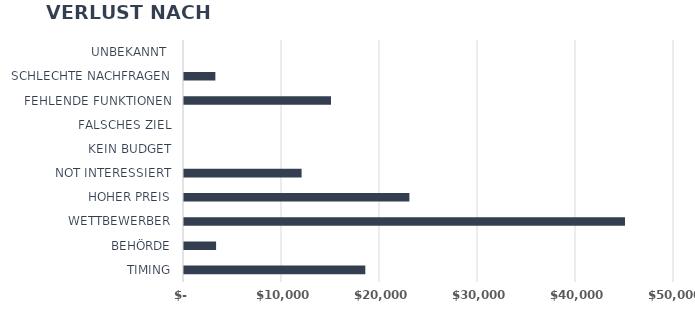
| Category | Series 1 |
|---|---|
| TIMING | 18500 |
| BEHÖRDE | 3275 |
| WETTBEWERBER | 45000 |
| HOHER PREIS | 23000 |
| NOT INTERESSIERT | 12000 |
| KEIN BUDGET | 0 |
| FALSCHES ZIEL | 0 |
| FEHLENDE FUNKTIONEN | 15000 |
| SCHLECHTE NACHFRAGEN | 3200 |
| UNBEKANNT  | 0 |